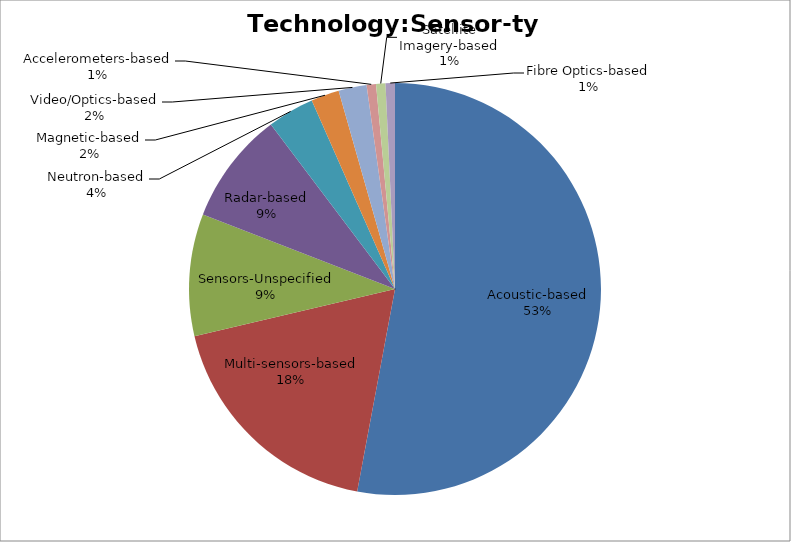
| Category | Technology:Sensor-type |
|---|---|
| Acoustic-based | 72 |
| Multi-sensors-based | 25 |
| Sensors-Unspecified | 13 |
| Radar-based | 12 |
| Neutron-based | 5 |
| Magnetic-based | 3 |
| Video/Optics-based | 3 |
| Accelerometers-based | 1 |
| Satellite Imagery-based | 1 |
| Fibre Optics-based | 1 |